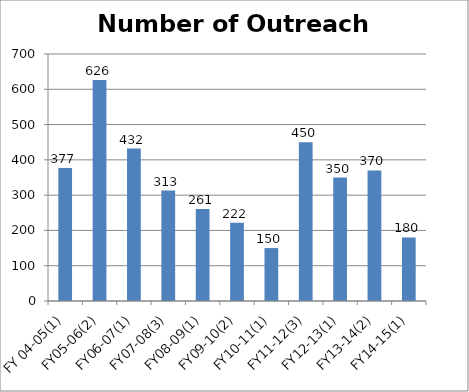
| Category | Number of Outreach Events |
|---|---|
| FY 04-05(1) | 377 |
| FY05-06(2) | 626 |
| FY06-07(1) | 432 |
| FY07-08(3) | 313 |
| FY08-09(1) | 261 |
| FY09-10(2) | 222 |
| FY10-11(1) | 150 |
| FY11-12(3) | 450 |
| FY12-13(1) | 350 |
| FY13-14(2) | 370 |
| FY14-15(1) | 180 |